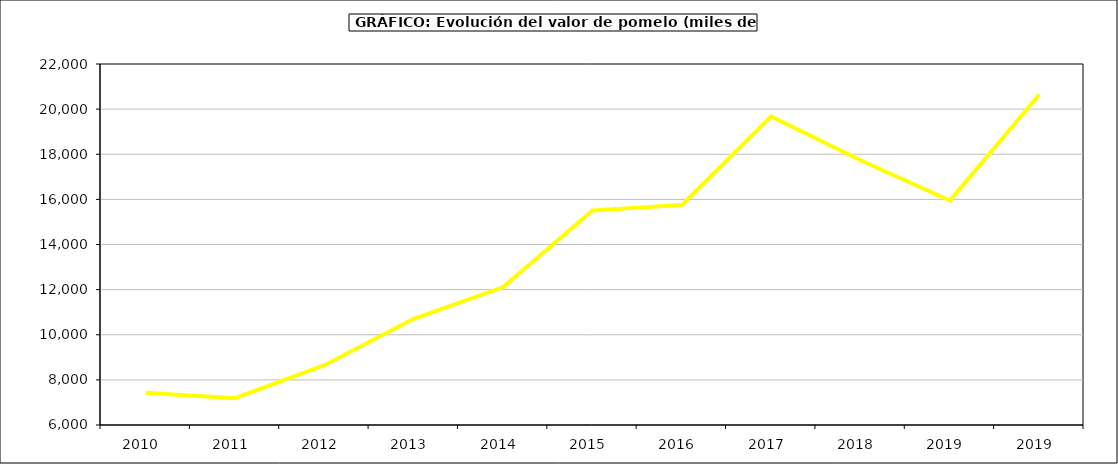
| Category | Valor |
|---|---|
| 2010.0 | 7430.969 |
| 2011.0 | 7186.419 |
| 2012.0 | 8649.711 |
| 2013.0 | 10707.894 |
| 2014.0 | 12111.902 |
| 2015.0 | 15505 |
| 2016.0 | 15755 |
| 2017.0 | 19680.125 |
| 2018.0 | 17733.461 |
| 2019.0 | 15945.486 |
| 2019.0 | 20651.517 |